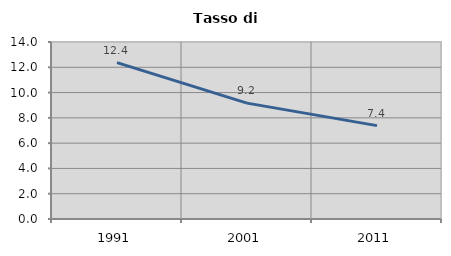
| Category | Tasso di disoccupazione   |
|---|---|
| 1991.0 | 12.366 |
| 2001.0 | 9.164 |
| 2011.0 | 7.385 |